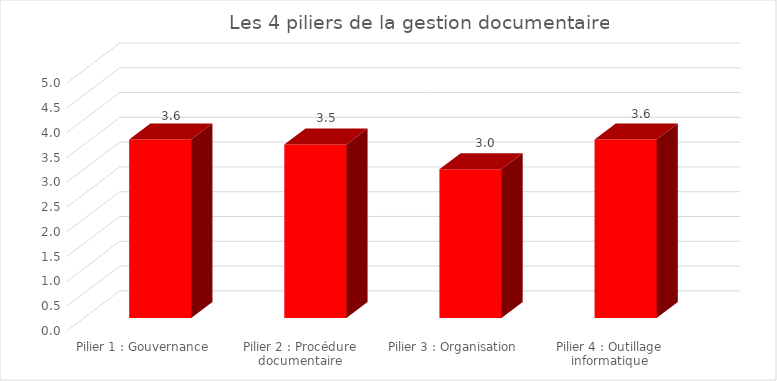
| Category | Series 0 |
|---|---|
| Pilier 1 : Gouvernance | 3.6 |
| Pilier 2 : Procédure documentaire | 3.5 |
| Pilier 3 : Organisation | 3 |
| Pilier 4 : Outillage informatique | 3.6 |